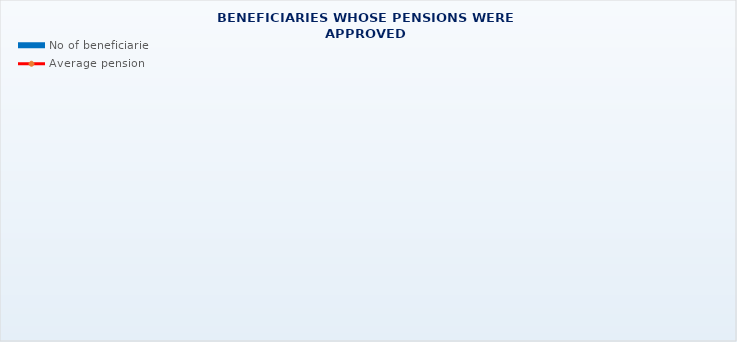
| Category | No of beneficiaries |
|---|---|
| Authorised officials in internal affairs, judicial officers and workers engaged in demining work: | 17264 |
| Pension beneficiaries entitled under the Fire Services Act (Official Gazette 125/19)* | 17 |
| Active military personnel - DVO  | 15748 |
| Croatian Homeland Army veterans mobilised from 1941 to 1945 | 3741 |
| Former political prisoners | 2735 |
| Croatian Veterans from the Homeland War - ZOHBDR (Act on Croatian Homeland War Veterans and Their Family Members) | 71107 |
| Pensions approved under general regulations and determined according to the Act on the Rights of Croatian Homeland War Veterans and their Family Members (ZOHBDR), in 2017 (Art. 27, 35, 48 and 49, paragraph 2)    | 44621 |
| Former Yugoslav People's Army members - JNA   | 5188 |
| Former Yugoslav People's Army members - JNA - Art. 185 of Pension Insurance Act (ZOMO)  | 145 |
| National Liberation War veterans - NOR | 8976 |
| Members of the Croatian Parliament, members of the Government, judges of the Constitutional Court and the Auditor General | 673 |
| Members of the Parliamentary Executive Council and administratively retired federal civil servants  (relates to the former SFRY) | 92 |
| Former officials of federal bodies o the former SFRJ -  Article 38 of the Pension Insurance Act (ZOMO) | 30 |
| Full members of the Croatian Academy of Sciences and Arts - HAZU | 138 |
| Miners from the Istrian coal mines "Tupljak" d.d. Labin  | 254 |
| Workers professionally exposed to asbestos | 864 |
| Insurees - crew members on a ship in international and national navigation  - Article  129, paragraph 2 of the Maritime Code | 182 |
| Members of the Croatian Defence Council - HVO  | 6724 |